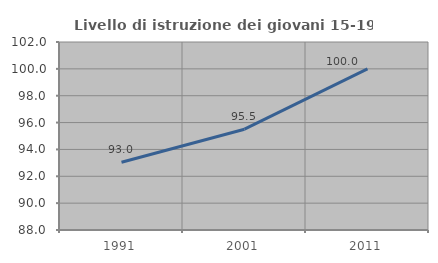
| Category | Livello di istruzione dei giovani 15-19 anni |
|---|---|
| 1991.0 | 93.043 |
| 2001.0 | 95.506 |
| 2011.0 | 100 |